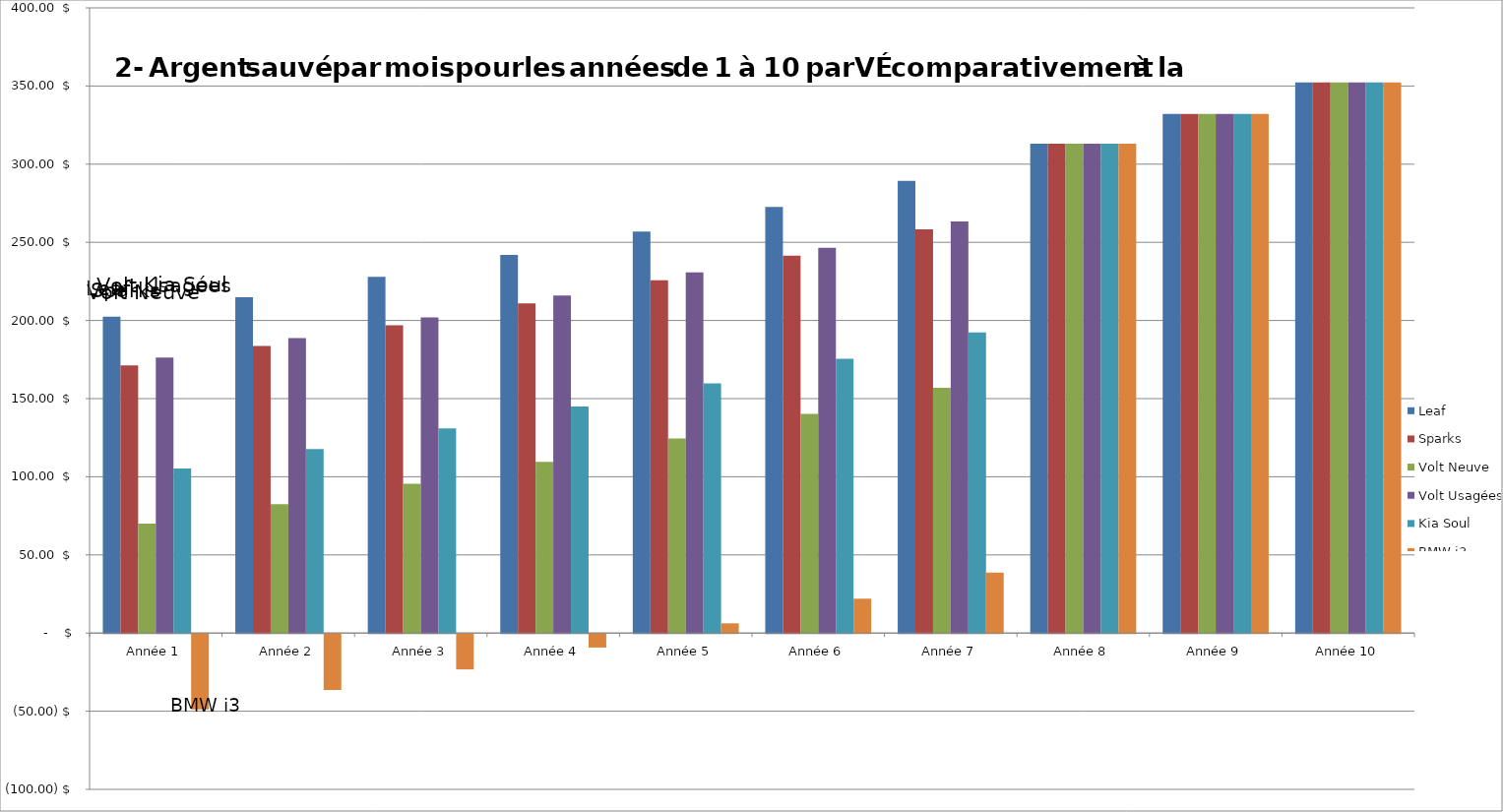
| Category | Leaf | Sparks | Volt Neuve | Volt Usagées | Kia Soul | BMW i3 |
|---|---|---|---|---|---|---|
| Année 1 | 202.38 | 171.267 | 69.98 | 176.33 | 105.357 | -48.216 |
| Année 2 | 214.797 | 183.684 | 82.397 | 188.747 | 117.774 | -35.8 |
| Année 3 | 227.974 | 196.861 | 95.574 | 201.924 | 130.951 | -22.622 |
| Année 4 | 241.964 | 210.85 | 109.564 | 215.914 | 144.94 | -8.633 |
| Année 5 | 256.819 | 225.706 | 124.419 | 230.769 | 159.796 | 6.222 |
| Année 6 | 272.6 | 241.486 | 140.2 | 246.55 | 175.576 | 22.003 |
| Année 7 | 289.368 | 258.255 | 156.968 | 263.318 | 192.345 | 38.772 |
| Année 8 | 313.147 | 313.147 | 313.147 | 313.147 | 313.147 | 313.147 |
| Année 9 | 332.101 | 332.101 | 332.101 | 332.101 | 332.101 | 332.101 |
| Année 10 | 352.265 | 352.265 | 352.265 | 352.265 | 352.265 | 352.265 |